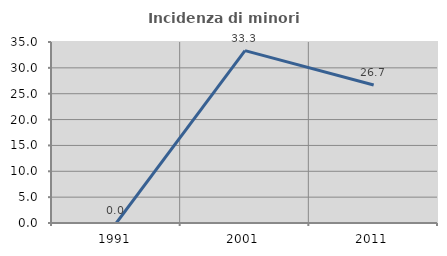
| Category | Incidenza di minori stranieri |
|---|---|
| 1991.0 | 0 |
| 2001.0 | 33.333 |
| 2011.0 | 26.697 |